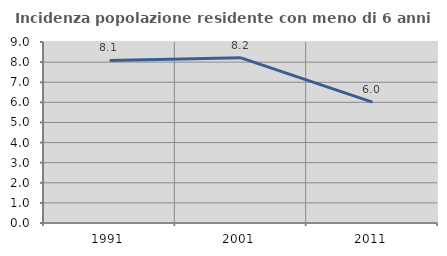
| Category | Incidenza popolazione residente con meno di 6 anni |
|---|---|
| 1991.0 | 8.084 |
| 2001.0 | 8.213 |
| 2011.0 | 6.011 |